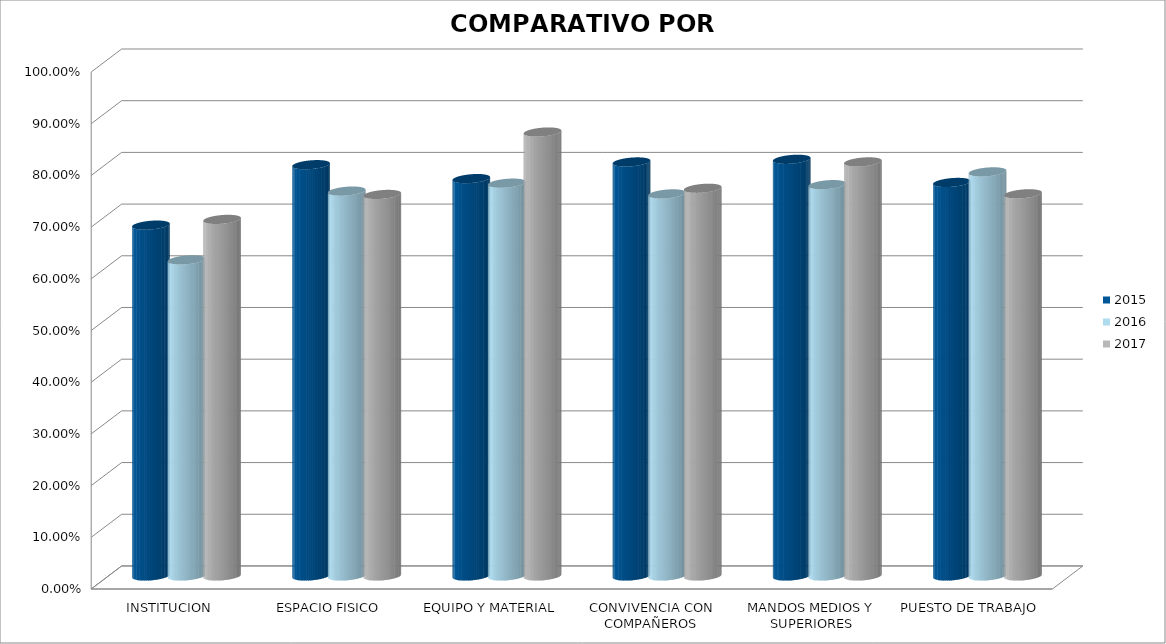
| Category | 2015 | 2016 | 2017 |
|---|---|---|---|
| INSTITUCION | 0.679 | 0.612 | 0.69 |
| ESPACIO FISICO | 0.796 | 0.745 | 0.738 |
| EQUIPO Y MATERIAL | 0.769 | 0.76 | 0.859 |
| CONVIVENCIA CON COMPAÑEROS | 0.801 | 0.739 | 0.75 |
| MANDOS MEDIOS Y SUPERIORES | 0.806 | 0.757 | 0.801 |
| PUESTO DE TRABAJO | 0.761 | 0.782 | 0.739 |